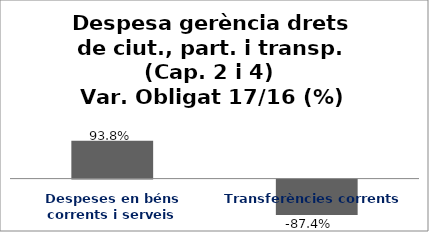
| Category | Series 0 |
|---|---|
| Despeses en béns corrents i serveis | 0.938 |
| Transferències corrents | -0.874 |